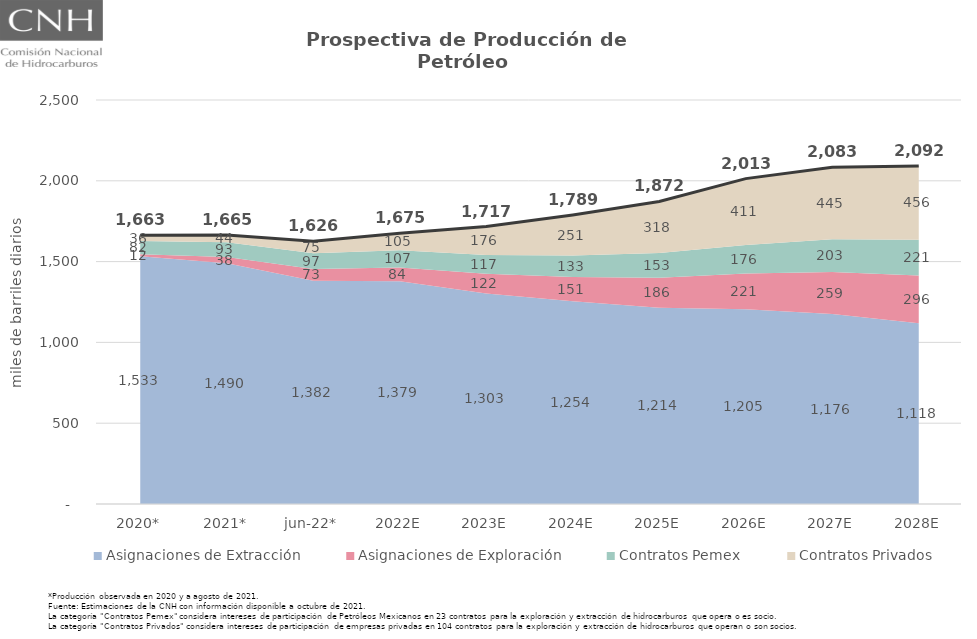
| Category | Total |
|---|---|
| 2020* | 1663.042 |
| 2021* | 1664.708 |
| jun-22* | 1626.428 |
| 2022E | 1675.409 |
| 2023E | 1716.756 |
| 2024E | 1788.584 |
| 2025E | 1871.92 |
| 2026E | 2013.387 |
| 2027E | 2083.109 |
| 2028E | 2091.513 |